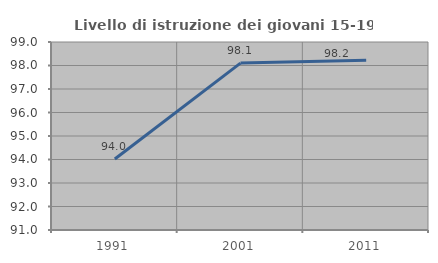
| Category | Livello di istruzione dei giovani 15-19 anni |
|---|---|
| 1991.0 | 94.019 |
| 2001.0 | 98.103 |
| 2011.0 | 98.222 |